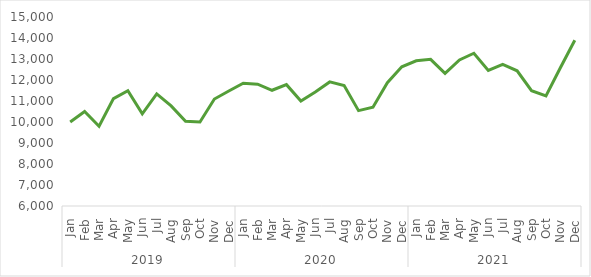
| Category | Total |
|---|---|
| 0 | 10000 |
| 1 | 10500 |
| 2 | 9800 |
| 3 | 11112 |
| 4 | 11493 |
| 5 | 10390 |
| 6 | 11342 |
| 7 | 10764 |
| 8 | 10039 |
| 9 | 10003 |
| 10 | 11095 |
| 11 | 11479 |
| 12 | 11847 |
| 13 | 11802 |
| 14 | 11511 |
| 15 | 11779 |
| 16 | 11000 |
| 17 | 11429 |
| 18 | 11909 |
| 19 | 11733 |
| 20 | 10541 |
| 21 | 10703 |
| 22 | 11872 |
| 23 | 12627 |
| 24 | 12913 |
| 25 | 12982 |
| 26 | 12317 |
| 27 | 12957 |
| 28 | 13275 |
| 29 | 12458 |
| 30 | 12743 |
| 31 | 12437 |
| 32 | 11490 |
| 33 | 11238 |
| 34 | 12584 |
| 35 | 13890 |